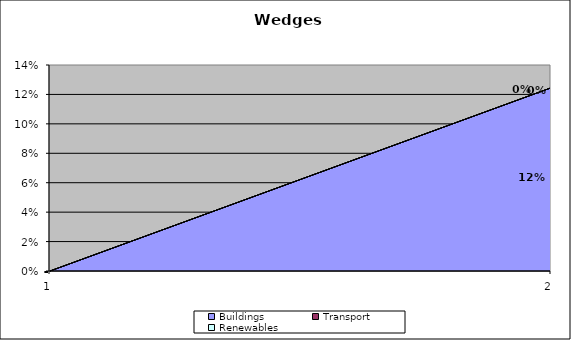
| Category | Buildings | Transport | Renewables |
|---|---|---|---|
| 0 | 0 | 0 | 0 |
| 1 | 0.124 | 0 | 0 |